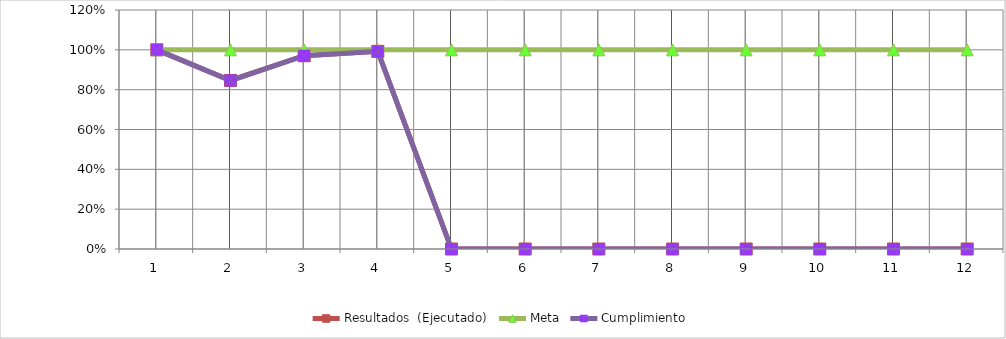
| Category | Resultados  (Ejecutado) | Meta | Cumplimiento |
|---|---|---|---|
| 0 | 1 | 1 | 1 |
| 1 | 0.846 | 1 | 0.846 |
| 2 | 0.97 | 1 | 0.97 |
| 3 | 0.992 | 1 | 0.992 |
| 4 | 0 | 1 | 0 |
| 5 | 0 | 1 | 0 |
| 6 | 0 | 1 | 0 |
| 7 | 0 | 1 | 0 |
| 8 | 0 | 1 | 0 |
| 9 | 0 | 1 | 0 |
| 10 | 0 | 1 | 0 |
| 11 | 0 | 1 | 0 |